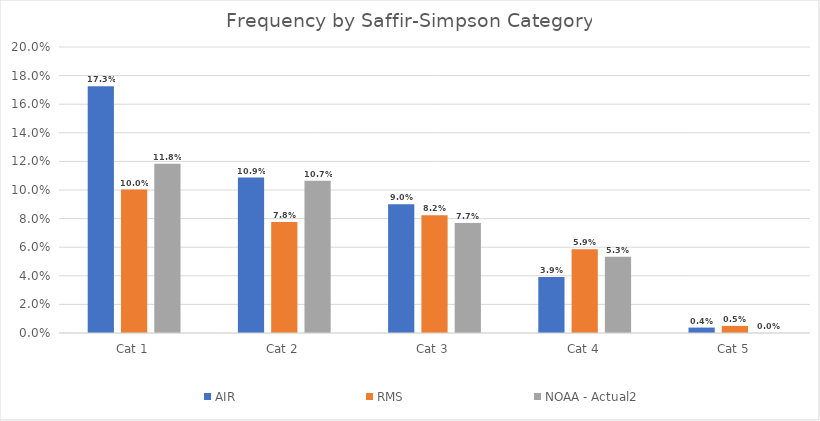
| Category | AIR | RMS | NOAA - Actual2 |
|---|---|---|---|
| Cat 1 | 0.173 | 0.1 | 0.118 |
| Cat 2 | 0.109 | 0.078 | 0.107 |
| Cat 3 | 0.09 | 0.082 | 0.077 |
| Cat 4 | 0.039 | 0.059 | 0.053 |
| Cat 5 | 0.004 | 0.005 | 0 |